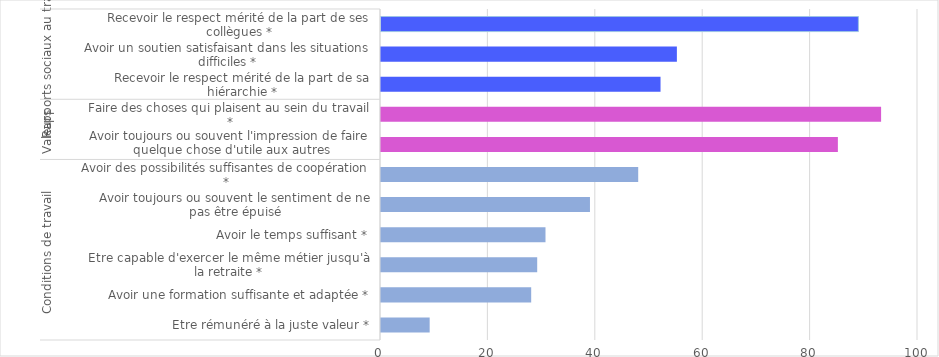
| Category | Series 0 |
|---|---|
| 0 | 9.062 |
| 1 | 27.968 |
| 2 | 29.087 |
| 3 | 30.631 |
| 4 | 38.913 |
| 5 | 47.897 |
| 6 | 85.079 |
| 7 | 93.127 |
| 8 | 52.055 |
| 9 | 55.099 |
| 10 | 88.902 |